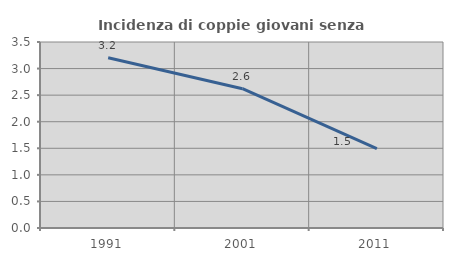
| Category | Incidenza di coppie giovani senza figli |
|---|---|
| 1991.0 | 3.205 |
| 2001.0 | 2.621 |
| 2011.0 | 1.496 |